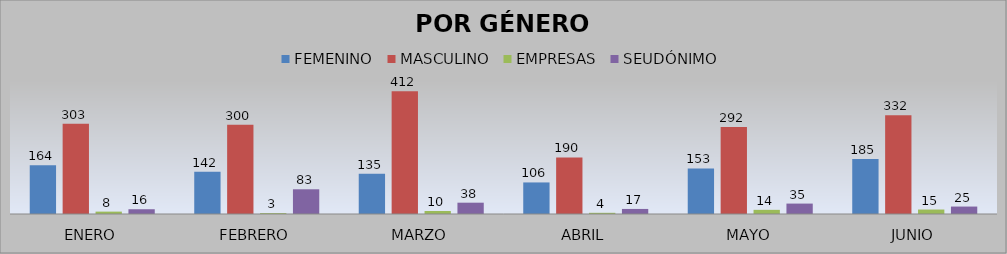
| Category | FEMENINO | MASCULINO | EMPRESAS | SEUDÓNIMO |
|---|---|---|---|---|
| ENERO | 164 | 303 | 8 | 16 |
| FEBRERO | 142 | 300 | 3 | 83 |
| MARZO | 135 | 412 | 10 | 38 |
| ABRIL | 106 | 190 | 4 | 17 |
| MAYO | 153 | 292 | 14 | 35 |
| JUNIO | 185 | 332 | 15 | 25 |